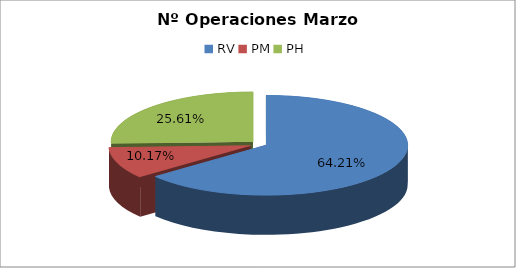
| Category | Series 0 |
|---|---|
| RV | 23177 |
| PM | 3671 |
| PH | 9245 |